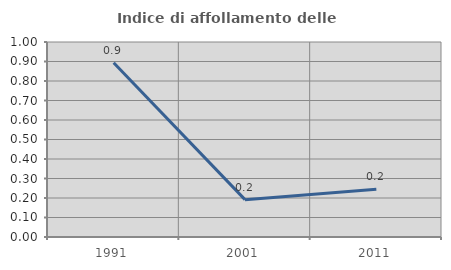
| Category | Indice di affollamento delle abitazioni  |
|---|---|
| 1991.0 | 0.893 |
| 2001.0 | 0.192 |
| 2011.0 | 0.245 |